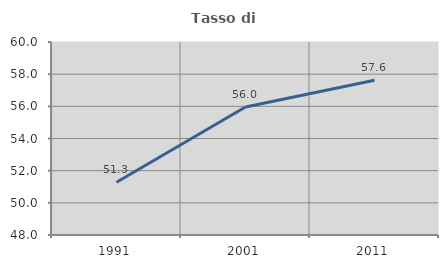
| Category | Tasso di occupazione   |
|---|---|
| 1991.0 | 51.284 |
| 2001.0 | 55.954 |
| 2011.0 | 57.616 |